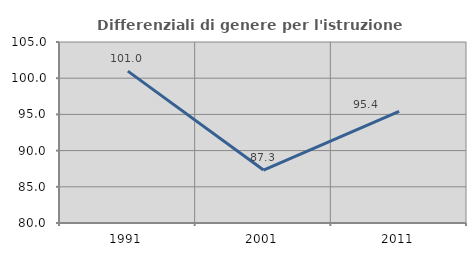
| Category | Differenziali di genere per l'istruzione superiore |
|---|---|
| 1991.0 | 100.978 |
| 2001.0 | 87.315 |
| 2011.0 | 95.422 |